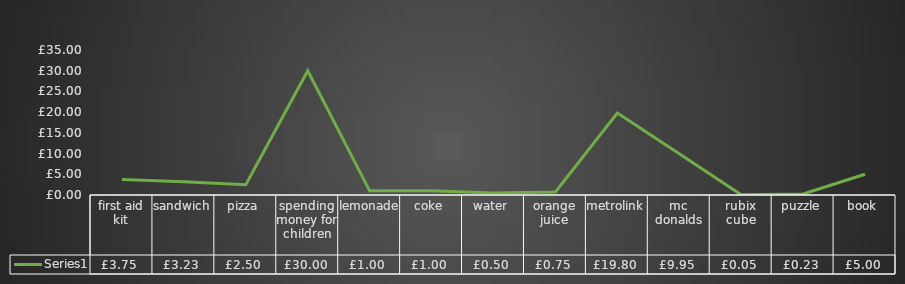
| Category | Series 0 |
|---|---|
| first aid kit | 3.75 |
| sandwich | 3.225 |
| pizza | 2.495 |
| spending money for children | 30 |
| lemonade | 1 |
| coke | 1 |
| water | 0.5 |
| orange juice | 0.75 |
| metrolink | 19.8 |
| mc donalds | 9.95 |
| rubix cube | 0.05 |
| puzzle | 0.23 |
| book | 5 |